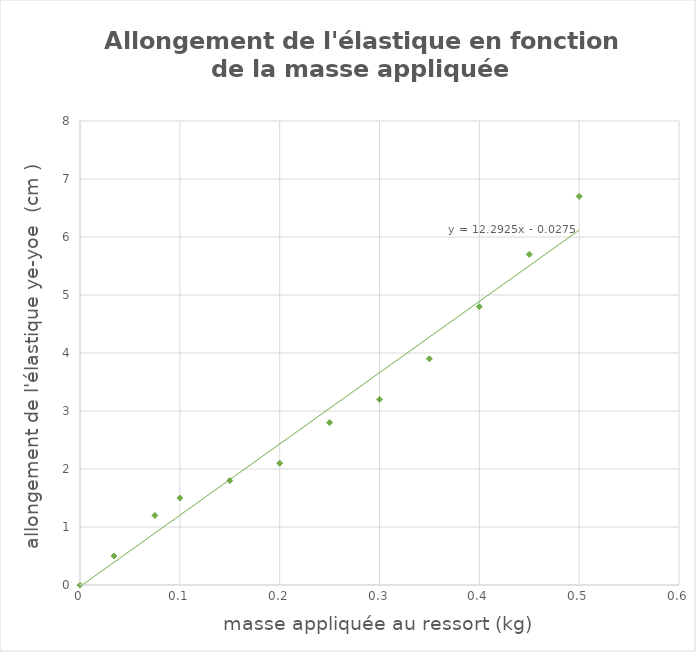
| Category | Series 0 |
|---|---|
| 0.034 | 0.5 |
| 0.075 | 1.2 |
| 0.1 | 1.5 |
| 0.15 | 1.8 |
| 0.2 | 2.1 |
| 0.25 | 2.8 |
| 0.3 | 3.2 |
| 0.35 | 3.9 |
| 0.4 | 4.8 |
| 0.45 | 5.7 |
| 0.5 | 6.7 |
| 0.0 | 0 |